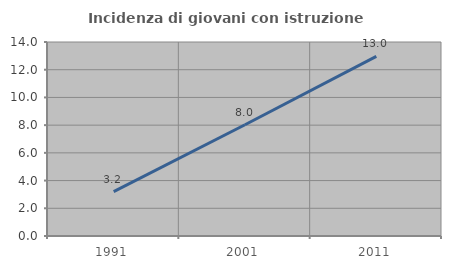
| Category | Incidenza di giovani con istruzione universitaria |
|---|---|
| 1991.0 | 3.209 |
| 2001.0 | 8.029 |
| 2011.0 | 12.968 |